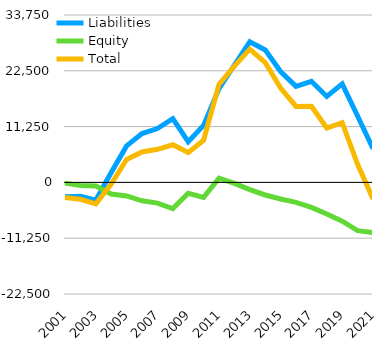
| Category | Liabilities  | Equity  | Total  |
|---|---|---|---|
| 2001 | -2894.5 | -143.5 | -3038 |
| 2002 | -2793.8 | -609.5 | -3403.3 |
| 2003 | -3593.2 | -724.4 | -4317.6 |
| 2004 | 2007.4 | -2335.4 | -328 |
| 2005 | 7363.8 | -2737 | 4626.8 |
| 2006 | 9846.2 | -3717.6 | 6128.6 |
| 2007 | 10848.4 | -4173.3 | 6675.1 |
| 2008 | 12847 | -5264.3 | 7582.7 |
| 2009 | 8205.5 | -2196.5 | 6009 |
| 2010 | 11497.6 | -3004.7 | 8492.9 |
| 2011 | 18911 | 849.8 | 19760.8 |
| 2012 | 23658.1 | -208.5 | 23449.6 |
| 2013 | 28334.6 | -1465.5 | 26869.1 |
| 2014 | 26709.1 | -2536.6 | 24172.5 |
| 2015 | 22357.8 | -3351.4 | 19006.4 |
| 2016 | 19359.8 | -4038.2 | 15321.6 |
| 2017 | 20376.4 | -5031.8 | 15344.6 |
| 2018 | 17335.7 | -6373.3 | 10962.4 |
| 2019 | 19873.2 | -7818 | 12055.2 |
| 2020 | 13389.5 | -9734.2 | 3655.3 |
| 2021 | 6779.5 | -10127.9 | -3348.4 |